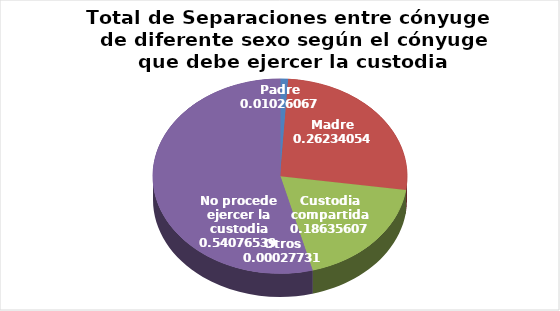
| Category | Series 0 |
|---|---|
| Padre | 37 |
| Madre | 946 |
| Custodia compartida | 672 |
| Otros | 1 |
| No procede ejercer la custodia | 1950 |